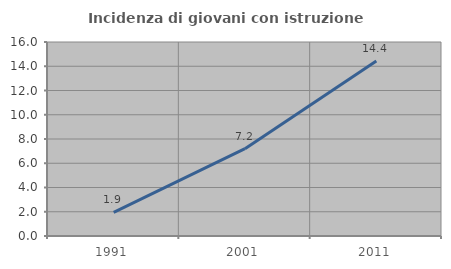
| Category | Incidenza di giovani con istruzione universitaria |
|---|---|
| 1991.0 | 1.942 |
| 2001.0 | 7.2 |
| 2011.0 | 14.433 |